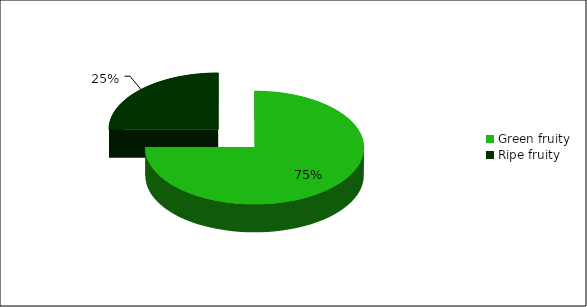
| Category | Number of judge |
|---|---|
| Green fruity | 6 |
| Ripe fruity | 2 |